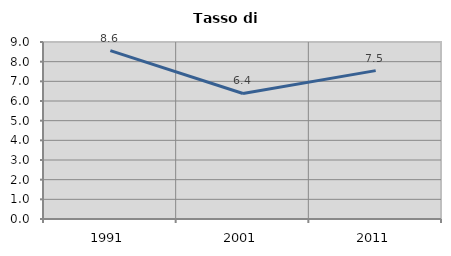
| Category | Tasso di disoccupazione   |
|---|---|
| 1991.0 | 8.559 |
| 2001.0 | 6.382 |
| 2011.0 | 7.544 |